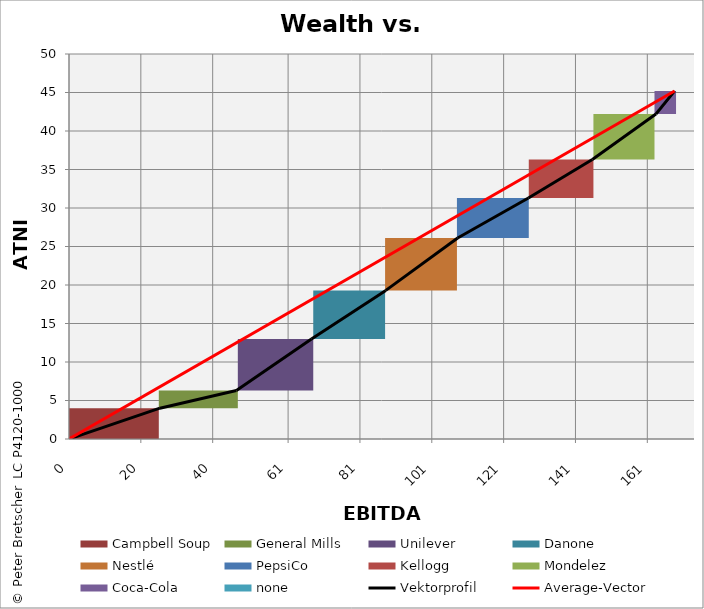
| Category | transparent | Campbell Soup | General Mills | Unilever | Danone | Nestlé | PepsiCo | Kellogg | Mondelez | Coca-Cola | none | Border right & top |
|---|---|---|---|---|---|---|---|---|---|---|---|---|
| 0.0 | 0 | 4 | 0 | 0 | 0 | 0 | 0 | 0 | 0 | 0 | 0 | 0 |
| 25.3 | 0 | 4 | 0 | 0 | 0 | 0 | 0 | 0 | 0 | 0 | 0 | 0 |
| 25.3 | 4 | 0 | 2.3 | 0 | 0 | 0 | 0 | 0 | 0 | 0 | 0 | 0 |
| 46.6 | 4 | 0 | 2.3 | 0 | 0 | 0 | 0 | 0 | 0 | 0 | 0 | 0 |
| 46.6 | 6.3 | 0 | 0 | 6.7 | 0 | 0 | 0 | 0 | 0 | 0 | 0 | 0 |
| 67.5 | 6.3 | 0 | 0 | 6.7 | 0 | 0 | 0 | 0 | 0 | 0 | 0 | 0 |
| 67.5 | 13 | 0 | 0 | 0 | 6.3 | 0 | 0 | 0 | 0 | 0 | 0 | 0 |
| 88.2 | 13 | 0 | 0 | 0 | 6.3 | 0 | 0 | 0 | 0 | 0 | 0 | 0 |
| 88.2 | 19.3 | 0 | 0 | 0 | 0 | 6.8 | 0 | 0 | 0 | 0 | 0 | 0 |
| 108.2 | 19.3 | 0 | 0 | 0 | 0 | 6.8 | 0 | 0 | 0 | 0 | 0 | 0 |
| 108.2 | 26.1 | 0 | 0 | 0 | 0 | 0 | 5.2 | 0 | 0 | 0 | 0 | 0 |
| 127.9 | 26.1 | 0 | 0 | 0 | 0 | 0 | 5.2 | 0 | 0 | 0 | 0 | 0 |
| 127.9 | 31.3 | 0 | 0 | 0 | 0 | 0 | 0 | 5 | 0 | 0 | 0 | 0 |
| 145.70000000000002 | 31.3 | 0 | 0 | 0 | 0 | 0 | 0 | 5 | 0 | 0 | 0 | 0 |
| 145.70000000000002 | 36.3 | 0 | 0 | 0 | 0 | 0 | 0 | 0 | 5.9 | 0 | 0 | 0 |
| 163.4 | 36.3 | 0 | 0 | 0 | 0 | 0 | 0 | 0 | 5.9 | 0 | 0 | 0 |
| 163.4 | 42.2 | 0 | 0 | 0 | 0 | 0 | 0 | 0 | 0 | 3 | 0 | 0 |
| 168.6 | 42.2 | 0 | 0 | 0 | 0 | 0 | 0 | 0 | 0 | 3 | 0 | 0 |
| 168.6 | 45.2 | 0 | 0 | 0 | 0 | 0 | 0 | 0 | 0 | 0 | 0 | 0 |
| 168.6 | 45.2 | 0 | 0 | 0 | 0 | 0 | 0 | 0 | 0 | 0 | 0 | 0 |
| 168.6 | 45.2 | 0 | 0 | 0 | 0 | 0 | 0 | 0 | 0 | 0 | 0 | 0 |
| 173.6 | 45.2 | 0 | 0 | 0 | 0 | 0 | 0 | 0 | 0 | 0 | 0 | 0 |
| 173.6 | 45.2 | 0 | 0 | 0 | 0 | 0 | 0 | 0 | 0 | 0 | 0 | 0 |